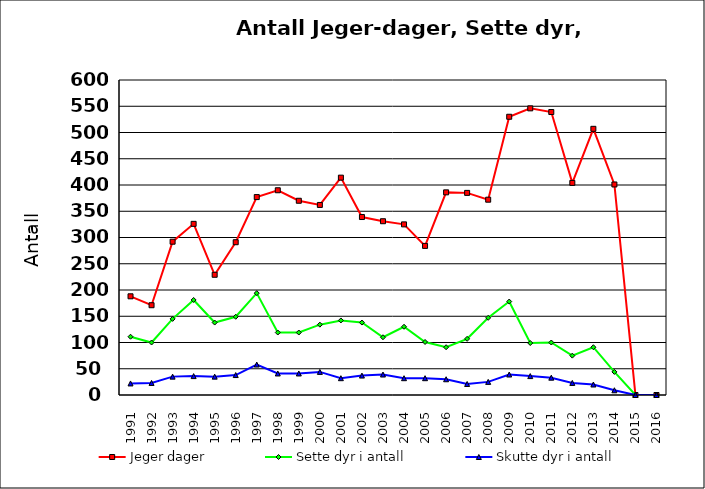
| Category | Jeger | Sette dyr i antall | Skutte dyr i antall |
|---|---|---|---|
| 1991.0 | 188 | 111 | 22 |
| 1992.0 | 171 | 100 | 23 |
| 1993.0 | 292 | 145 | 35 |
| 1994.0 | 326 | 181 | 36 |
| 1995.0 | 229 | 138 | 35 |
| 1996.0 | 291 | 149 | 38 |
| 1997.0 | 377 | 194 | 58 |
| 1998.0 | 390 | 119 | 41 |
| 1999.0 | 370 | 119 | 41 |
| 2000.0 | 362 | 134 | 44 |
| 2001.0 | 414 | 142 | 32 |
| 2002.0 | 339 | 138 | 37 |
| 2003.0 | 331 | 110 | 39 |
| 2004.0 | 325 | 130 | 32 |
| 2005.0 | 284 | 101 | 32 |
| 2006.0 | 386 | 91 | 30 |
| 2007.0 | 385 | 107 | 21 |
| 2008.0 | 372 | 147 | 25 |
| 2009.0 | 530 | 178 | 39 |
| 2010.0 | 546 | 99 | 36 |
| 2011.0 | 539 | 100 | 33 |
| 2012.0 | 404 | 75 | 23 |
| 2013.0 | 507 | 91 | 20 |
| 2014.0 | 401 | 44 | 9 |
| 2015.0 | 0 | 0 | 0 |
| 2016.0 | 0 | 0 | 0 |